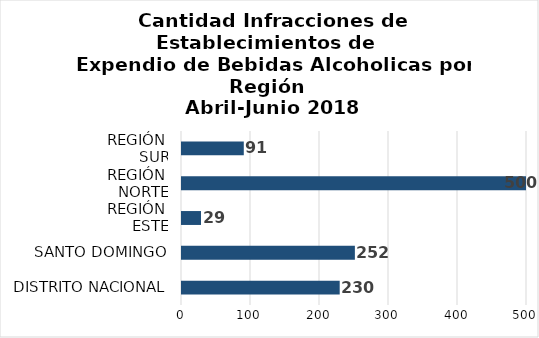
| Category | Series 0 |
|---|---|
| DISTRITO NACIONAL | 230 |
| SANTO DOMINGO | 252 |
| REGIÓN 
ESTE | 29 |
| REGIÓN 
NORTE | 500 |
| REGIÓN 
SUR | 91 |